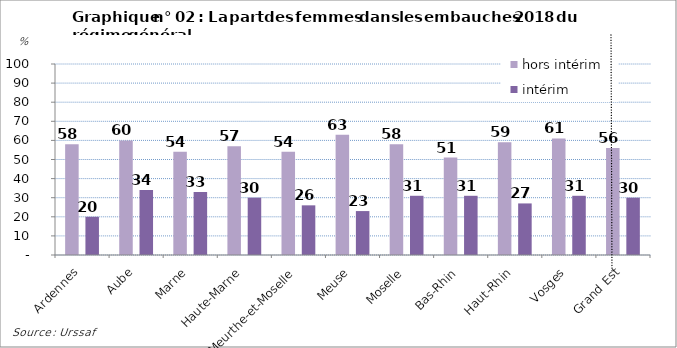
| Category | hors intérim | intérim |
|---|---|---|
| Ardennes | 58 | 20 |
| Aube | 60 | 34 |
| Marne | 54 | 33 |
| Haute-Marne | 57 | 30 |
| Meurthe-et-Moselle | 54 | 26 |
| Meuse | 63 | 23 |
| Moselle | 58 | 31 |
| Bas-Rhin | 51 | 31 |
| Haut-Rhin | 59 | 27 |
| Vosges | 61 | 31 |
| Grand Est | 56 | 30 |